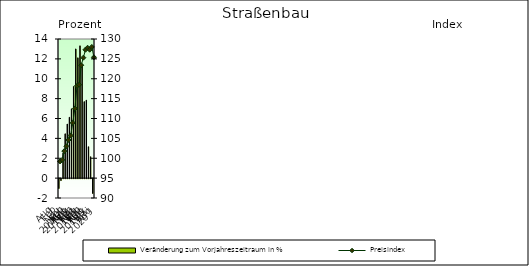
| Category | Veränderung zum Vorjahreszeitraum in % |
|---|---|
| 0 | -0.998 |
| 1 | -0.2 |
| 2 | 2.518 |
| 3 | 4.462 |
| 4 | 5.444 |
| 5 | 6.124 |
| 6 | 6.974 |
| 7 | 9.223 |
| 8 | 13.002 |
| 9 | 12.11 |
| 10 | 13.315 |
| 11 | 11.378 |
| 12 | 7.699 |
| 13 | 7.848 |
| 14 | 3.16 |
| 15 | 2.155 |
| 16 | -1.493 |